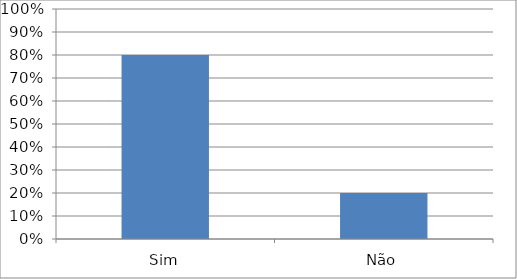
| Category | Series 0 |
|---|---|
| Sim | 0.8 |
| Não | 0.2 |